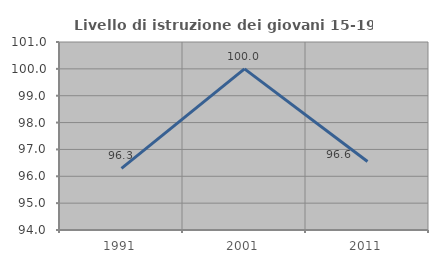
| Category | Livello di istruzione dei giovani 15-19 anni |
|---|---|
| 1991.0 | 96.296 |
| 2001.0 | 100 |
| 2011.0 | 96.552 |